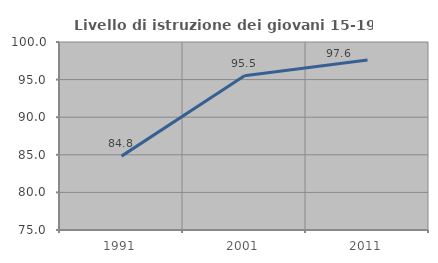
| Category | Livello di istruzione dei giovani 15-19 anni |
|---|---|
| 1991.0 | 84.823 |
| 2001.0 | 95.517 |
| 2011.0 | 97.603 |